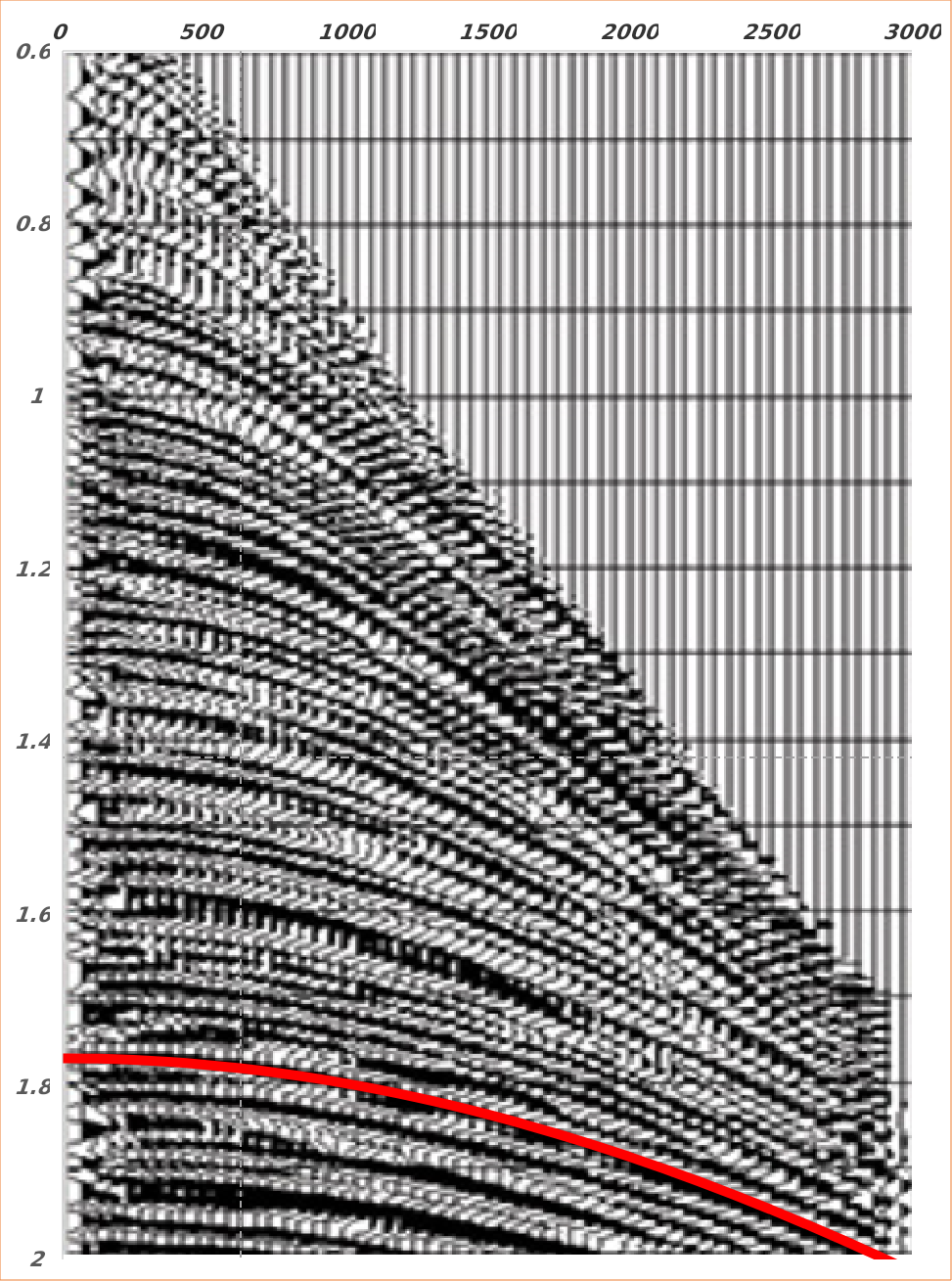
| Category | Series 0 |
|---|---|
| 0.0 | 1.767 |
| 125.0 | 1.767 |
| 250.0 | 1.769 |
| 375.0 | 1.771 |
| 500.0 | 1.774 |
| 625.0 | 1.778 |
| 750.0 | 1.783 |
| 875.0 | 1.789 |
| 1000.0 | 1.796 |
| 1125.0 | 1.804 |
| 1250.0 | 1.812 |
| 1375.0 | 1.822 |
| 1500.0 | 1.832 |
| 1625.0 | 1.843 |
| 1750.0 | 1.855 |
| 1875.0 | 1.867 |
| 2000.0 | 1.881 |
| 2125.0 | 1.895 |
| 2250.0 | 1.91 |
| 2375.0 | 1.926 |
| 2500.0 | 1.942 |
| 2625.0 | 1.959 |
| 2750.0 | 1.977 |
| 2875.0 | 1.995 |
| 3000.0 | 2.014 |